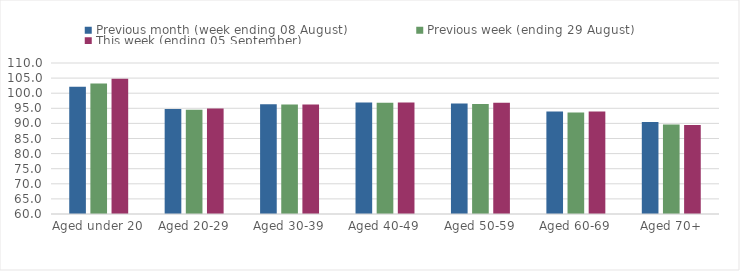
| Category | Previous month (week ending 08 August) | Previous week (ending 29 August) | This week (ending 05 September) |
|---|---|---|---|
| Aged under 20 | 102.15 | 103.23 | 104.79 |
| Aged 20-29 | 94.74 | 94.55 | 94.95 |
| Aged 30-39 | 96.35 | 96.27 | 96.27 |
| Aged 40-49 | 96.92 | 96.85 | 96.9 |
| Aged 50-59 | 96.56 | 96.43 | 96.82 |
| Aged 60-69 | 93.98 | 93.6 | 93.97 |
| Aged 70+ | 90.5 | 89.6 | 89.47 |